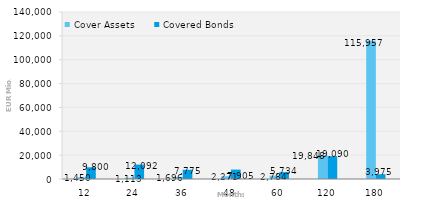
| Category | Cover Assets | Covered Bonds |
|---|---|---|
| 12.0 | 1449.965 | 9800 |
| 24.0 | 1112.514 | 12092.407 |
| 36.0 | 1695.688 | 7775 |
| 48.0 | 2271.493 | 7905.128 |
| 60.0 | 2784.48 | 5733.952 |
| 120.0 | 19848.115 | 19090 |
| 180.0 | 115957.054 | 3974.574 |